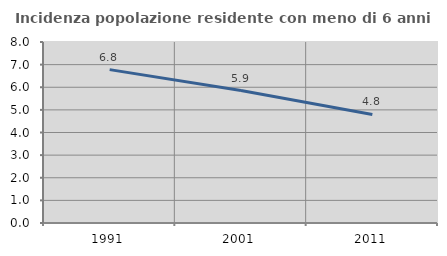
| Category | Incidenza popolazione residente con meno di 6 anni |
|---|---|
| 1991.0 | 6.78 |
| 2001.0 | 5.854 |
| 2011.0 | 4.797 |